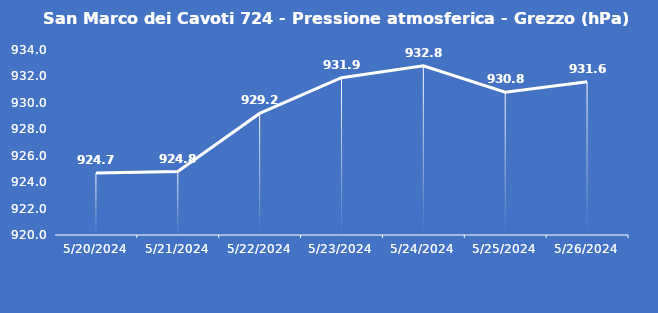
| Category | San Marco dei Cavoti 724 - Pressione atmosferica - Grezzo (hPa) |
|---|---|
| 5/20/24 | 924.7 |
| 5/21/24 | 924.8 |
| 5/22/24 | 929.2 |
| 5/23/24 | 931.9 |
| 5/24/24 | 932.8 |
| 5/25/24 | 930.8 |
| 5/26/24 | 931.6 |